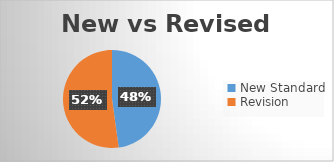
| Category | Series 0 |
|---|---|
| New Standard | 11 |
| Revision | 12 |